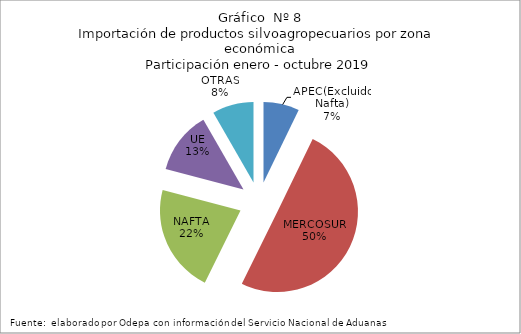
| Category | Series 0 |
|---|---|
| APEC(Excluido Nafta) | 381526.477 |
| MERCOSUR | 2655491.149 |
| NAFTA | 1154828.895 |
| UE | 667689.366 |
| OTRAS | 440037.113 |